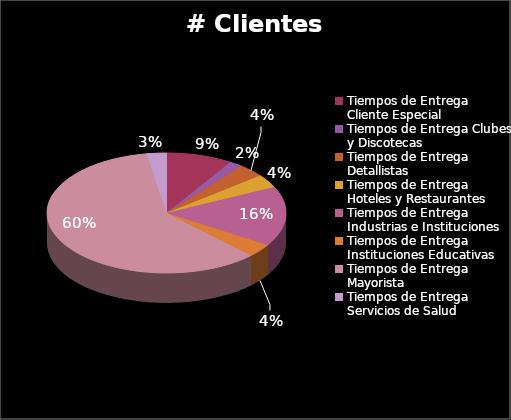
| Category | # Clientes Satisfechos |  % Satisfacción |
|---|---|---|
| 0 | 10 | 5.208 |
| 1 | 2 | 1.042 |
| 2 | 4 | 2.083 |
| 3 | 4 | 2.083 |
| 4 | 18 | 9.375 |
| 5 | 4 | 2.083 |
| 6 | 67 | 34.896 |
| 7 | 3 | 1.562 |